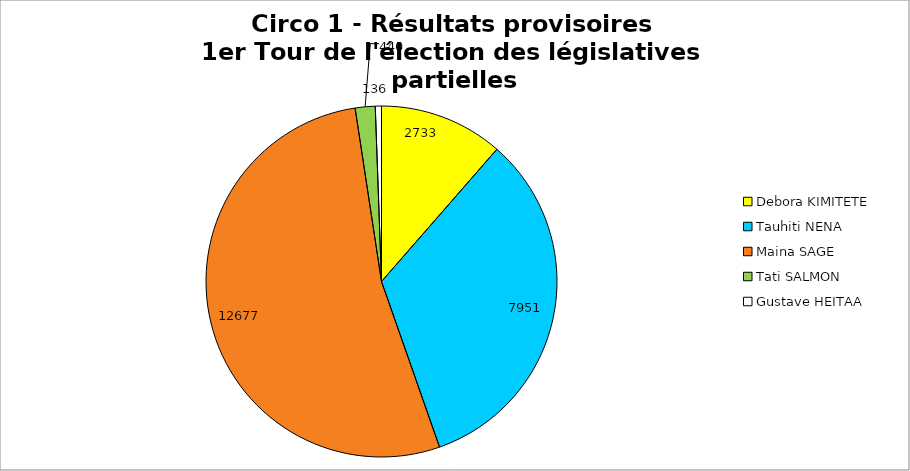
| Category | Series 0 |
|---|---|
| Debora KIMITETE | 2733 |
| Tauhiti NENA | 7951 |
| Maina SAGE | 12677 |
| Tati SALMON | 440 |
| Gustave HEITAA | 136 |